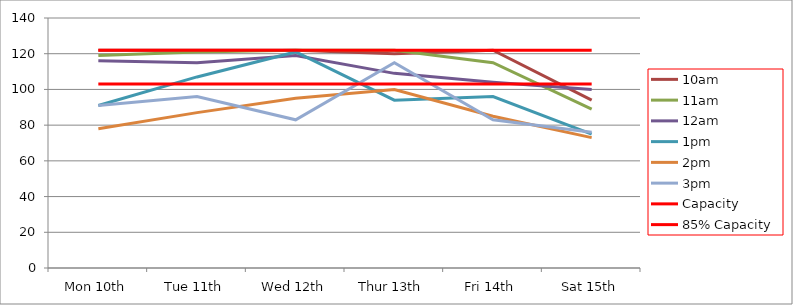
| Category | 9am | 10am | 11am | 12am | 1pm | 2pm | 3pm | 4pm | 5pm | Capacity | 85% Capacity |
|---|---|---|---|---|---|---|---|---|---|---|---|
| Mon 10th |  | 122 | 119 | 116 | 91 | 78 | 91 |  |  | 122 | 103 |
| Tue 11th |  | 122 | 121 | 115 | 107 | 87 | 96 |  |  | 122 | 103 |
| Wed 12th |  | 122 | 122 | 119 | 121 | 95 | 83 |  |  | 122 | 103 |
| Thur 13th |  | 120 | 122 | 109 | 94 | 100 | 115 |  |  | 122 | 103 |
| Fri 14th |  | 122 | 115 | 104 | 96 | 85 | 83 |  |  | 122 | 103 |
| Sat 15th |  | 94 | 89 | 100 | 75 | 73 | 76 |  |  | 122 | 103 |